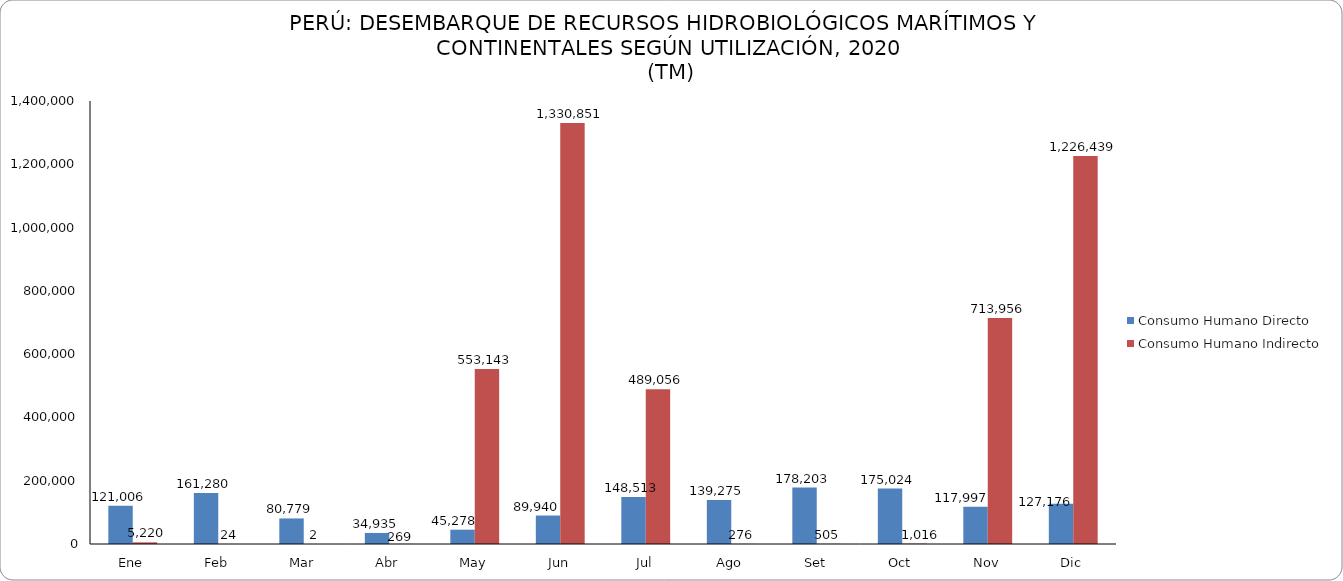
| Category | Consumo Humano Directo | Consumo Humano Indirecto |
|---|---|---|
| Ene | 121006 | 5220 |
| Feb | 161280 | 24 |
| Mar | 80779 | 2 |
| Abr | 34935 | 269 |
| May | 45278 | 553143 |
| Jun | 89940 | 1330851 |
| Jul | 148513 | 489056 |
| Ago | 139275 | 276 |
| Set | 178203 | 505 |
| Oct | 175024 | 1016 |
| Nov | 117997 | 713956 |
| Dic | 127176 | 1226439 |